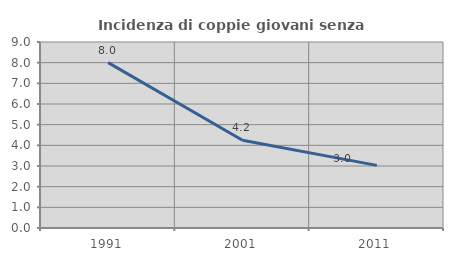
| Category | Incidenza di coppie giovani senza figli |
|---|---|
| 1991.0 | 8 |
| 2001.0 | 4.245 |
| 2011.0 | 3.03 |